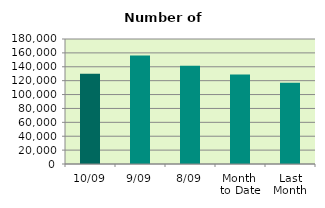
| Category | Series 0 |
|---|---|
| 10/09 | 130134 |
| 9/09 | 156182 |
| 8/09 | 141480 |
| Month 
to Date | 128947.25 |
| Last
Month | 117090.273 |